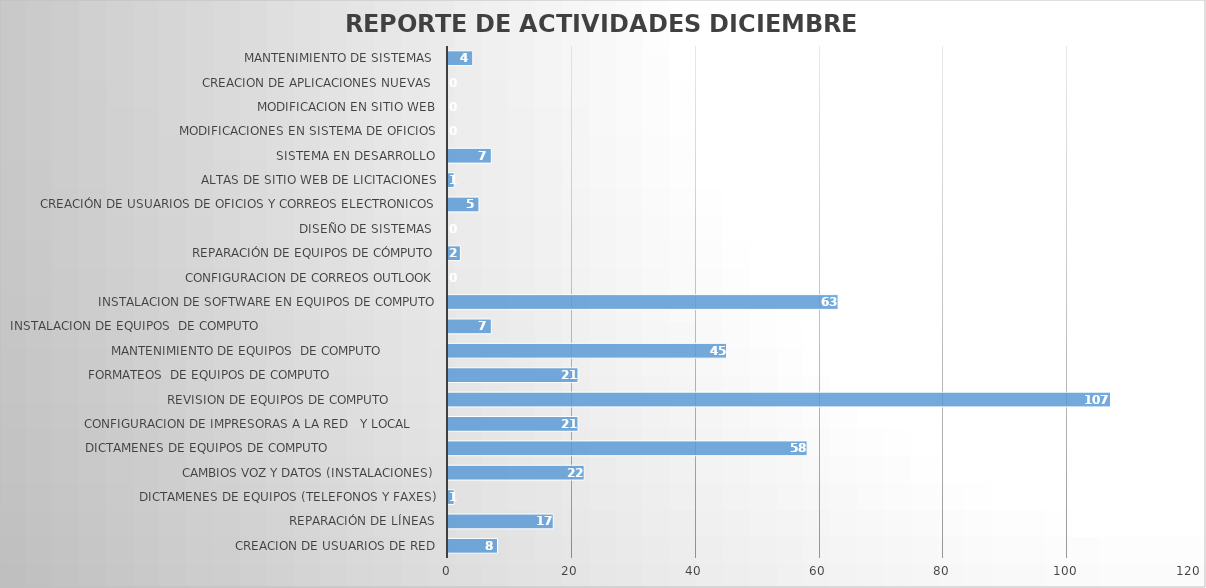
| Category | dic-22 |
|---|---|
| CREACION DE USUARIOS DE RED | 8 |
| REPARACIÓN DE LÍNEAS | 17 |
| DICTAMENES DE EQUIPOS (TELEFONOS Y FAXES) | 1 |
| CAMBIOS VOZ Y DATOS (INSTALACIONES) | 22 |
| DICTAMENES DE EQUIPOS DE COMPUTO                             | 58 |
| CONFIGURACION DE IMPRESORAS A LA RED   Y LOCAL       | 21 |
| REVISION DE EQUIPOS DE COMPUTO             | 107 |
| FORMATEOS  DE EQUIPOS DE COMPUTO                            | 21 |
| MANTENIMIENTO DE EQUIPOS  DE COMPUTO               | 45 |
| INSTALACION DE EQUIPOS  DE COMPUTO                                               | 7 |
| INSTALACION DE SOFTWARE EN EQUIPOS DE COMPUTO | 63 |
| CONFIGURACION DE CORREOS OUTLOOK | 0 |
| REPARACIÓN DE EQUIPOS DE CÓMPUTO | 2 |
| DISEÑO DE SISTEMAS  | 0 |
| CREACIÓN DE USUARIOS DE OFICIOS Y CORREOS ELECTRONICOS | 5 |
| ALTAS DE SITIO WEB DE LICITACIONES | 1 |
| SISTEMA EN DESARROLLO | 7 |
| MODIFICACIONES EN SISTEMA DE OFICIOS | 0 |
| MODIFICACION EN SITIO WEB | 0 |
| CREACION DE APLICACIONES NUEVAS  | 0 |
| MANTENIMIENTO DE SISTEMAS  | 4 |